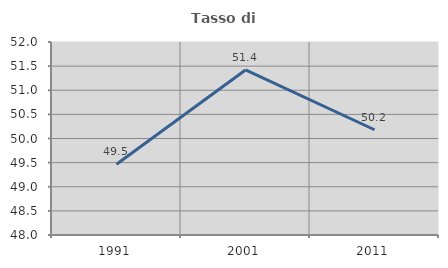
| Category | Tasso di occupazione   |
|---|---|
| 1991.0 | 49.466 |
| 2001.0 | 51.42 |
| 2011.0 | 50.181 |